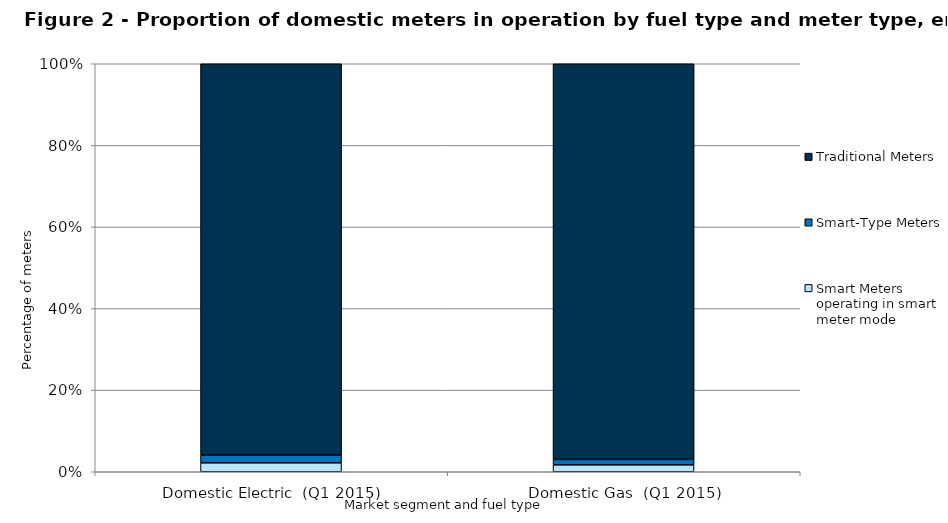
| Category | Smart Meters operating in smart meter mode | Smart-Type Meters | Traditional Meters |
|---|---|---|---|
| Domestic Electric  (Q1 2015) | 575602 | 501761 | 25239686 |
| Domestic Gas  (Q1 2015) | 367857 | 290443 | 21122165 |